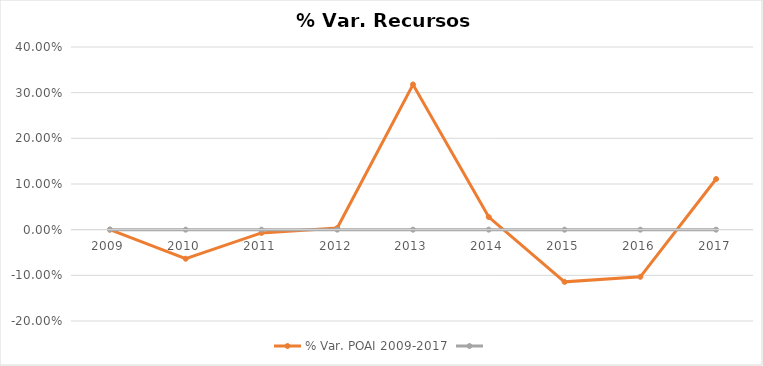
| Category | % Var. POAI 2009-2017 | #¡REF! |
|---|---|---|
| 2009.0 | 0 | 0 |
| 2010.0 | -0.064 | 0 |
| 2011.0 | -0.007 | 0 |
| 2012.0 | 0.004 | 0 |
| 2013.0 | 0.318 | 0 |
| 2014.0 | 0.028 | 0 |
| 2015.0 | -0.114 | 0 |
| 2016.0 | -0.103 | 0 |
| 2017.0 | 0.111 | 0 |